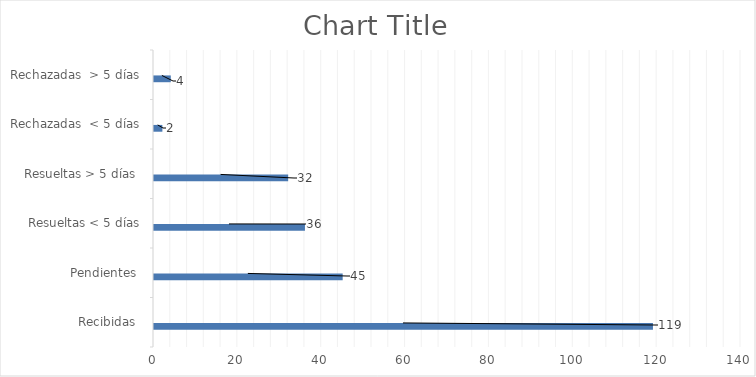
| Category | Física | PORTAL SAIP | 311 | Otras |
|---|---|---|---|---|
| Recibidas  | 0 | 119 | 0 | 0 |
| Pendientes  | 0 | 45 | 0 | 0 |
| Resueltas < 5 días | 0 | 36 | 0 | 0 |
| Resueltas > 5 días  | 0 | 32 | 0 | 0 |
| Rechazadas  < 5 días | 0 | 2 | 0 | 0 |
| Rechazadas  > 5 días | 0 | 4 | 0 | 0 |